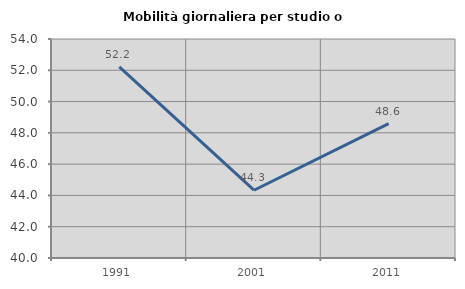
| Category | Mobilità giornaliera per studio o lavoro |
|---|---|
| 1991.0 | 52.222 |
| 2001.0 | 44.332 |
| 2011.0 | 48.592 |